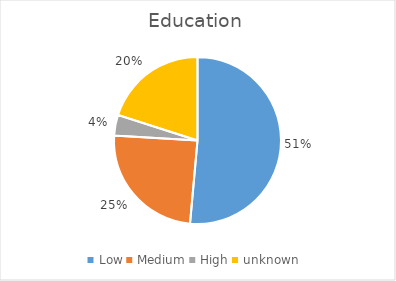
| Category | Education |
|---|---|
| Low | 0.514 |
| Medium | 0.245 |
| High | 0.04 |
| unknown | 0.201 |